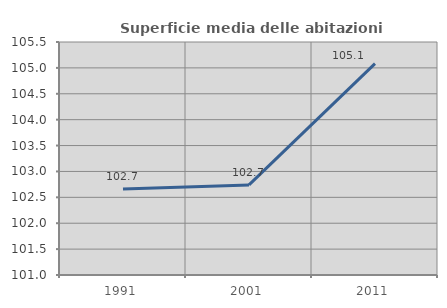
| Category | Superficie media delle abitazioni occupate |
|---|---|
| 1991.0 | 102.661 |
| 2001.0 | 102.739 |
| 2011.0 | 105.081 |